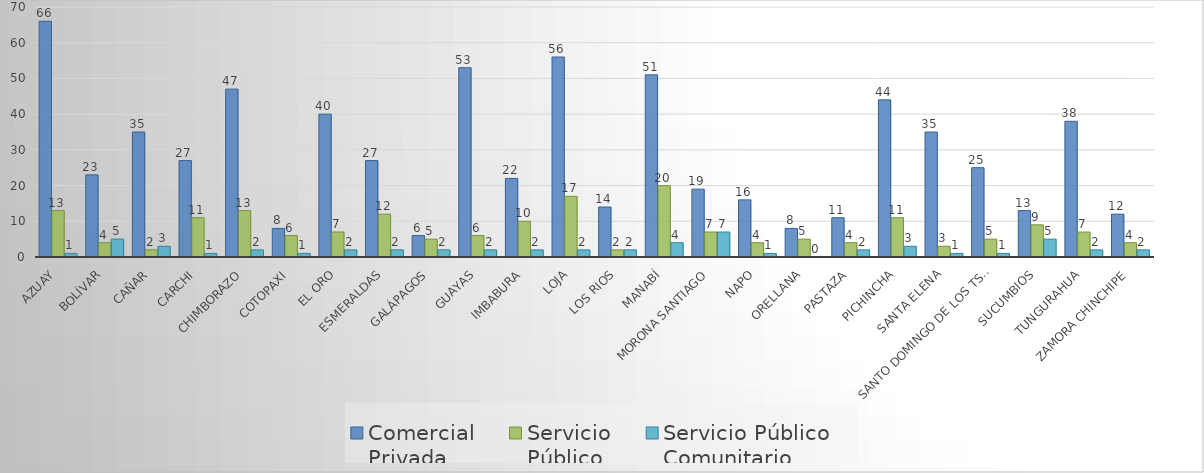
| Category | Comercial 
Privada | Servicio 
Público | Servicio Público
Comunitario |
|---|---|---|---|
| Azuay | 66 | 13 | 1 |
| Bolívar | 23 | 4 | 5 |
| Cañar | 35 | 2 | 3 |
| Carchi | 27 | 11 | 1 |
| Chimborazo | 47 | 13 | 2 |
| Cotopaxi | 8 | 6 | 1 |
| El Oro | 40 | 7 | 2 |
| Esmeraldas | 27 | 12 | 2 |
| Galápagos | 6 | 5 | 2 |
| Guayas | 53 | 6 | 2 |
| Imbabura | 22 | 10 | 2 |
| Loja | 56 | 17 | 2 |
| Los Rios | 14 | 2 | 2 |
| Manabí | 51 | 20 | 4 |
| Morona Santiago | 19 | 7 | 7 |
| Napo | 16 | 4 | 1 |
| Orellana | 8 | 5 | 0 |
| Pastaza | 11 | 4 | 2 |
| Pichincha | 44 | 11 | 3 |
| Santa Elena | 35 | 3 | 1 |
| Santo Domingo de los Tsáchilas | 25 | 5 | 1 |
| Sucumbios | 13 | 9 | 5 |
| Tungurahua | 38 | 7 | 2 |
| Zamora Chinchipe | 12 | 4 | 2 |